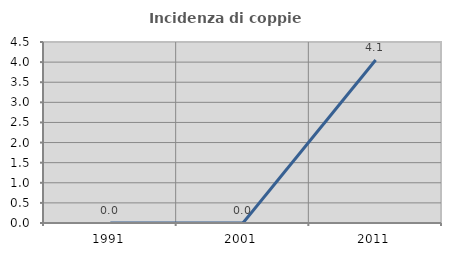
| Category | Incidenza di coppie miste |
|---|---|
| 1991.0 | 0 |
| 2001.0 | 0 |
| 2011.0 | 4.054 |